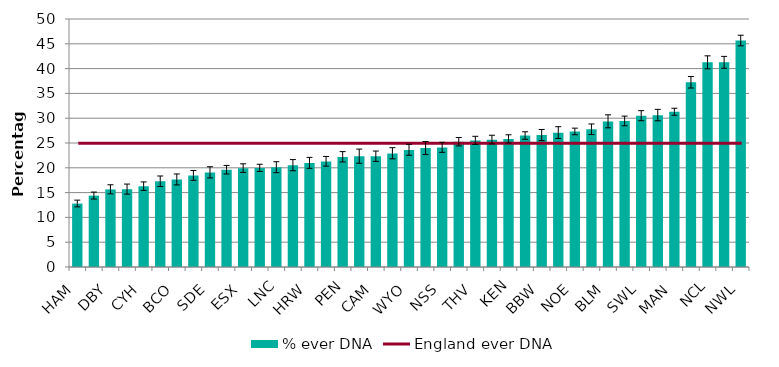
| Category | % ever DNA |
|---|---|
| HAM | 12.787 |
| YOH | 14.388 |
| DBY | 15.643 |
| COV | 15.68 |
| CYH | 16.283 |
| FRV | 17.265 |
| BCO | 17.624 |
| LEI | 18.45 |
| SDE | 19.063 |
| DOW | 19.6 |
| ESX | 19.927 |
| CHM | 19.978 |
| LNC | 20.099 |
| SOM | 20.507 |
| HRW | 20.977 |
| NOR | 21.293 |
| PEN | 22.2 |
| STW | 22.311 |
| CAM | 22.32 |
| GLO | 22.908 |
| WYO | 23.612 |
| NRH | 23.967 |
| NSS | 24.11 |
| WSU | 25.248 |
| THV | 25.527 |
| HOE | 25.679 |
| KEN | 25.819 |
| CML | 26.502 |
| BBW | 26.592 |
| NOT | 27.081 |
| NOE | 27.324 |
| WSR | 27.758 |
| BLM | 29.355 |
| SYB | 29.439 |
| SWL | 30.5 |
| HFD | 30.618 |
| MAN | 31.295 |
| SEL | 37.235 |
| NCL | 41.258 |
| NEL | 41.261 |
| NWL | 45.659 |